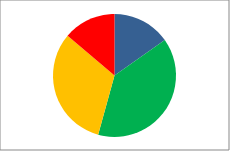
| Category | Series 1 |
|---|---|
| Outstanding | 32 |
| Good | 82 |
| RI | 67 |
| Inadequate | 29 |